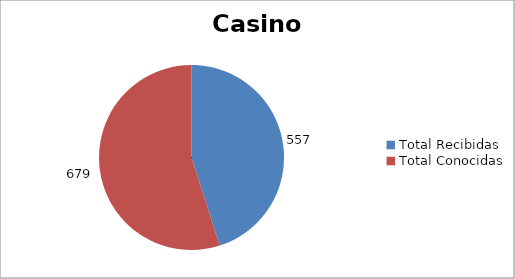
| Category | Series 0 |
|---|---|
| Total Recibidas | 557 |
| Total Conocidas | 679 |